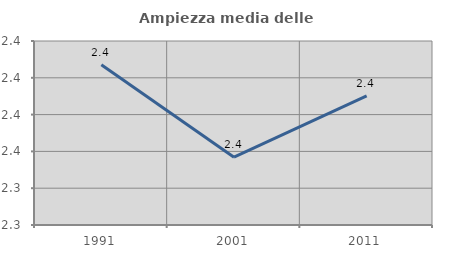
| Category | Ampiezza media delle famiglie |
|---|---|
| 1991.0 | 2.407 |
| 2001.0 | 2.357 |
| 2011.0 | 2.39 |